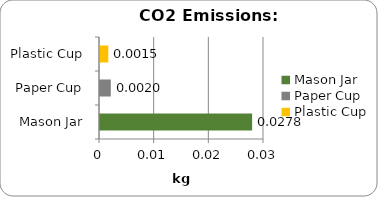
| Category | Series 0 |
|---|---|
| Mason Jar | 0.028 |
| Paper Cup | 0.002 |
| Plastic Cup | 0.002 |